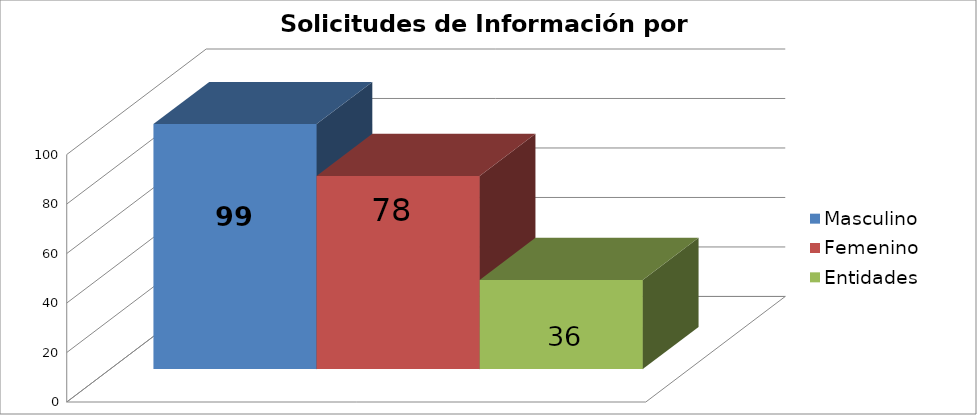
| Category | Masculino | Femenino | Entidades |
|---|---|---|---|
| 0 | 99 | 78 | 36 |